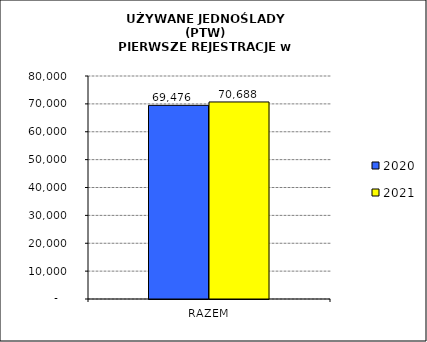
| Category | 2020 | 2021 |
|---|---|---|
| RAZEM | 69476 | 70688 |